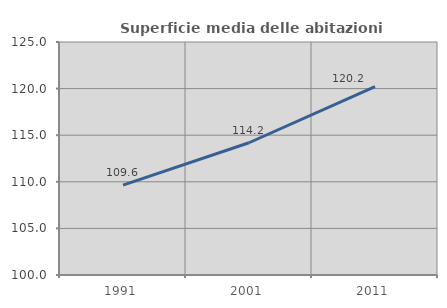
| Category | Superficie media delle abitazioni occupate |
|---|---|
| 1991.0 | 109.643 |
| 2001.0 | 114.19 |
| 2011.0 | 120.216 |